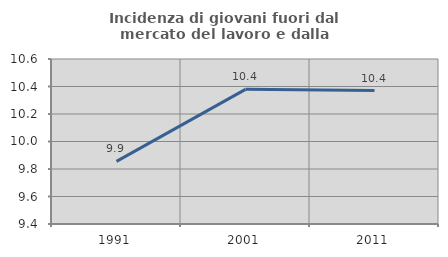
| Category | Incidenza di giovani fuori dal mercato del lavoro e dalla formazione  |
|---|---|
| 1991.0 | 9.855 |
| 2001.0 | 10.379 |
| 2011.0 | 10.37 |